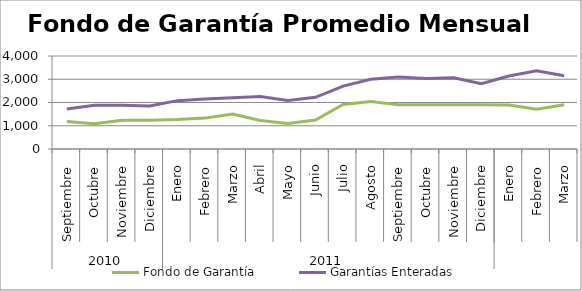
| Category | Fondo de Garantía | Garantías Enteradas |
|---|---|---|
| 0 | 1186.765 | 1723.136 |
| 1 | 1091.277 | 1878.561 |
| 2 | 1240.142 | 1886.493 |
| 3 | 1233.184 | 1848.941 |
| 4 | 1267.175 | 2079.773 |
| 5 | 1328.315 | 2151.804 |
| 6 | 1507.218 | 2200.488 |
| 7 | 1222.61 | 2253.818 |
| 8 | 1097.438 | 2081.441 |
| 9 | 1248.758 | 2223.666 |
| 10 | 1917.982 | 2706.525 |
| 11 | 2038.339 | 3002.384 |
| 12 | 1900.513 | 3095.395 |
| 13 | 1900.513 | 3029.373 |
| 14 | 1900.513 | 3060.179 |
| 15 | 1900.513 | 2809.042 |
| 16 | 1896.798 | 3141.641 |
| 17 | 1714.423 | 3362.648 |
| 18 | 1900.513 | 3154.118 |